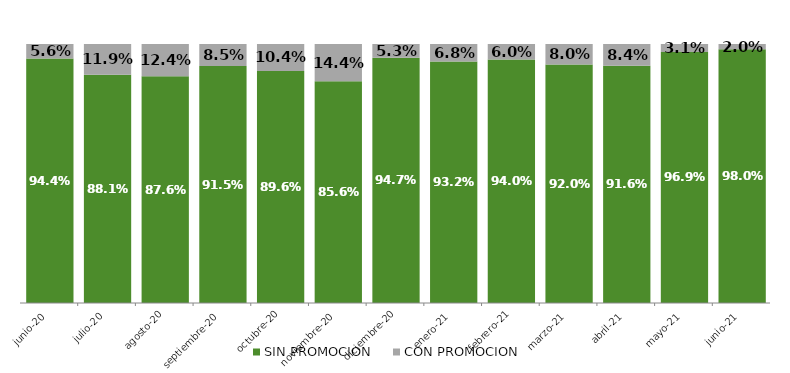
| Category | SIN PROMOCION   | CON PROMOCION   |
|---|---|---|
| 2020-06-01 | 0.944 | 0.056 |
| 2020-07-01 | 0.881 | 0.119 |
| 2020-08-01 | 0.876 | 0.124 |
| 2020-09-01 | 0.915 | 0.085 |
| 2020-10-01 | 0.896 | 0.104 |
| 2020-11-01 | 0.856 | 0.144 |
| 2020-12-01 | 0.947 | 0.053 |
| 2021-01-01 | 0.932 | 0.068 |
| 2021-02-01 | 0.94 | 0.06 |
| 2021-03-01 | 0.92 | 0.08 |
| 2021-04-01 | 0.916 | 0.084 |
| 2021-05-01 | 0.969 | 0.031 |
| 2021-06-01 | 0.98 | 0.02 |